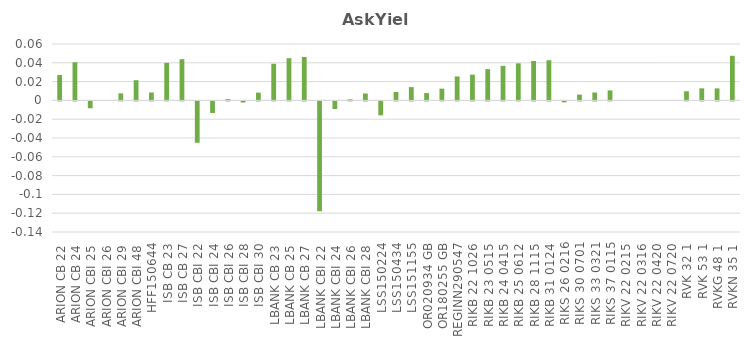
| Category | Series 0 |
|---|---|
| ARION CB 22 | 0.027 |
| ARION CB 24 | 0.041 |
| ARION CBI 25 | -0.007 |
| ARION CBI 26 | 0 |
| ARION CBI 29 | 0.007 |
| ARION CBI 48 | 0.021 |
| HFF150644 | 0.008 |
| ISB CB 23 | 0.04 |
| ISB CB 27 | 0.044 |
| ISB CBI 22 | -0.044 |
| ISB CBI 24 | -0.012 |
| ISB CBI 26 | 0.001 |
| ISB CBI 28 | -0.001 |
| ISB CBI 30 | 0.008 |
| LBANK CB 23 | 0.039 |
| LBANK CB 25 | 0.045 |
| LBANK CB 27 | 0.046 |
| LBANK CBI 22 | -0.117 |
| LBANK CBI 24 | -0.008 |
| LBANK CBI 26 | 0.001 |
| LBANK CBI 28 | 0.007 |
| LSS150224 | -0.015 |
| LSS150434 | 0.009 |
| LSS151155 | 0.014 |
| OR020934 GB | 0.008 |
| OR180255 GB | 0.012 |
| REGINN290547 | 0.025 |
| RIKB 22 1026 | 0.027 |
| RIKB 23 0515 | 0.033 |
| RIKB 24 0415 | 0.037 |
| RIKB 25 0612 | 0.039 |
| RIKB 28 1115 | 0.042 |
| RIKB 31 0124 | 0.043 |
| RIKS 26 0216 | -0.001 |
| RIKS 30 0701 | 0.006 |
| RIKS 33 0321 | 0.008 |
| RIKS 37 0115 | 0.011 |
| RIKV 22 0215 | 0 |
| RIKV 22 0316 | 0 |
| RIKV 22 0420 | 0 |
| RIKV 22 0720 | 0 |
| RVK 32 1 | 0.01 |
| RVK 53 1 | 0.013 |
| RVKG 48 1 | 0.013 |
| RVKN 35 1 | 0.047 |